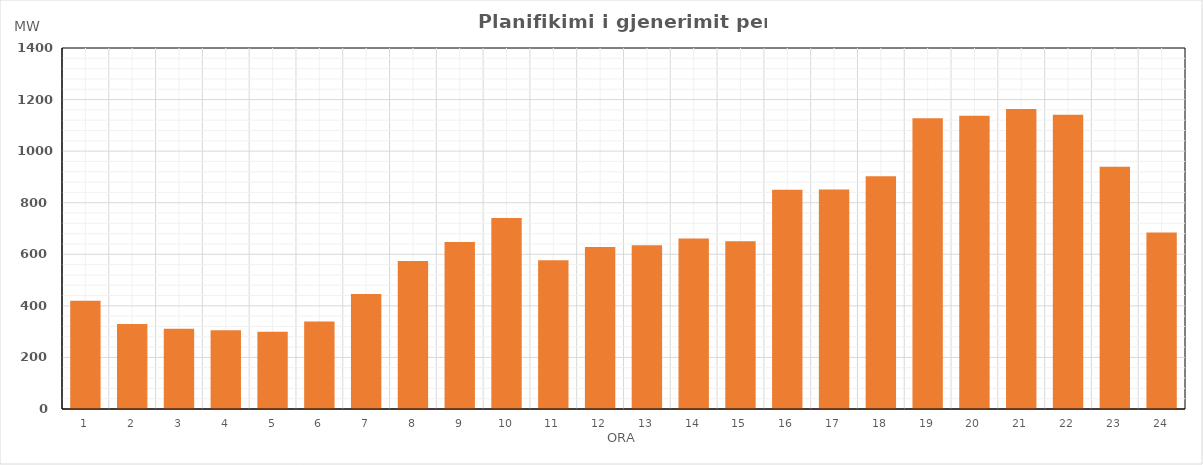
| Category | Max (MW) |
|---|---|
| 0 | 420.053 |
| 1 | 329.964 |
| 2 | 311.087 |
| 3 | 305.63 |
| 4 | 299.507 |
| 5 | 339.776 |
| 6 | 445.934 |
| 7 | 573.755 |
| 8 | 647.383 |
| 9 | 740.583 |
| 10 | 577.019 |
| 11 | 628.487 |
| 12 | 635.272 |
| 13 | 661.196 |
| 14 | 650.624 |
| 15 | 849.903 |
| 16 | 851.046 |
| 17 | 903.03 |
| 18 | 1127.94 |
| 19 | 1136.895 |
| 20 | 1163.685 |
| 21 | 1141.573 |
| 22 | 939.822 |
| 23 | 684.667 |